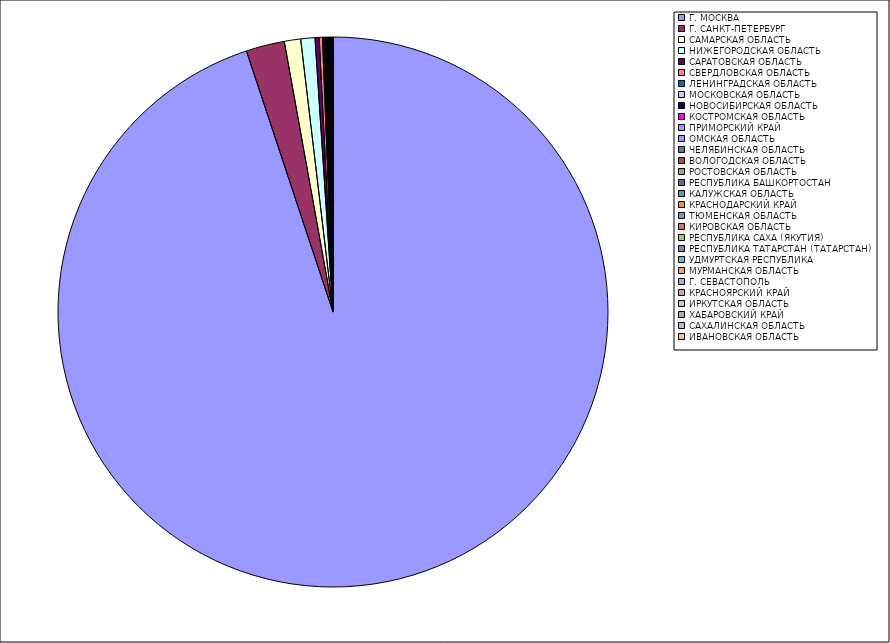
| Category | Оборот |
|---|---|
| Г. МОСКВА | 94.868 |
| Г. САНКТ-ПЕТЕРБУРГ | 2.259 |
| САМАРСКАЯ ОБЛАСТЬ | 0.959 |
| НИЖЕГОРОДСКАЯ ОБЛАСТЬ | 0.834 |
| САРАТОВСКАЯ ОБЛАСТЬ | 0.243 |
| СВЕРДЛОВСКАЯ ОБЛАСТЬ | 0.192 |
| ЛЕНИНГРАДСКАЯ ОБЛАСТЬ | 0.07 |
| МОСКОВСКАЯ ОБЛАСТЬ | 0.062 |
| НОВОСИБИРСКАЯ ОБЛАСТЬ | 0.04 |
| КОСТРОМСКАЯ ОБЛАСТЬ | 0.04 |
| ПРИМОРСКИЙ КРАЙ | 0.04 |
| ОМСКАЯ ОБЛАСТЬ | 0.036 |
| ЧЕЛЯБИНСКАЯ ОБЛАСТЬ | 0.036 |
| ВОЛОГОДСКАЯ ОБЛАСТЬ | 0.03 |
| РОСТОВСКАЯ ОБЛАСТЬ | 0.029 |
| РЕСПУБЛИКА БАШКОРТОСТАН | 0.026 |
| КАЛУЖСКАЯ ОБЛАСТЬ | 0.025 |
| КРАСНОДАРСКИЙ КРАЙ | 0.024 |
| ТЮМЕНСКАЯ ОБЛАСТЬ | 0.022 |
| КИРОВСКАЯ ОБЛАСТЬ | 0.017 |
| РЕСПУБЛИКА САХА (ЯКУТИЯ) | 0.017 |
| РЕСПУБЛИКА ТАТАРСТАН (ТАТАРСТАН) | 0.016 |
| УДМУРТСКАЯ РЕСПУБЛИКА | 0.016 |
| МУРМАНСКАЯ ОБЛАСТЬ | 0.015 |
| Г. СЕВАСТОПОЛЬ | 0.013 |
| КРАСНОЯРСКИЙ КРАЙ | 0.009 |
| ИРКУТСКАЯ ОБЛАСТЬ | 0.008 |
| ХАБАРОВСКИЙ КРАЙ | 0.007 |
| САХАЛИНСКАЯ ОБЛАСТЬ | 0.006 |
| ИВАНОВСКАЯ ОБЛАСТЬ | 0.005 |